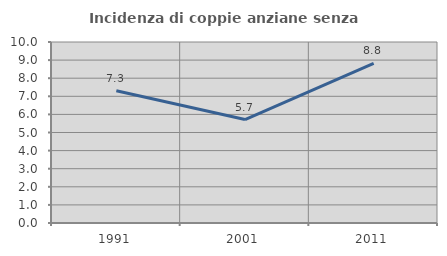
| Category | Incidenza di coppie anziane senza figli  |
|---|---|
| 1991.0 | 7.311 |
| 2001.0 | 5.714 |
| 2011.0 | 8.824 |